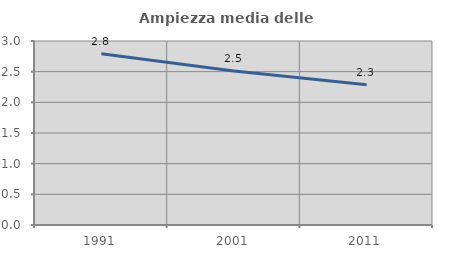
| Category | Ampiezza media delle famiglie |
|---|---|
| 1991.0 | 2.791 |
| 2001.0 | 2.509 |
| 2011.0 | 2.289 |